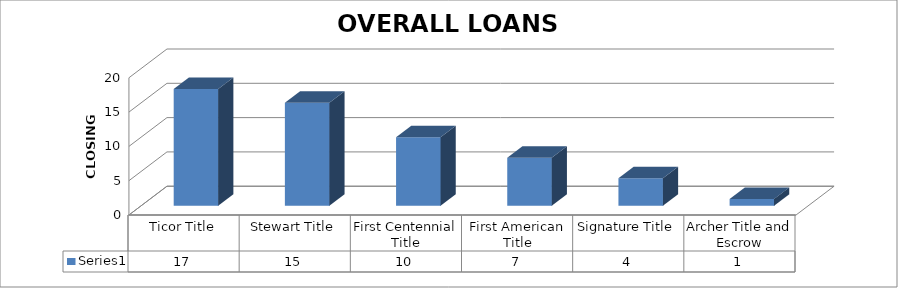
| Category | Series 0 |
|---|---|
| Ticor Title | 17 |
| Stewart Title | 15 |
| First Centennial Title | 10 |
| First American Title | 7 |
| Signature Title | 4 |
| Archer Title and Escrow | 1 |